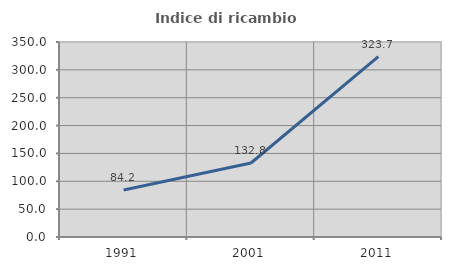
| Category | Indice di ricambio occupazionale  |
|---|---|
| 1991.0 | 84.242 |
| 2001.0 | 132.817 |
| 2011.0 | 323.741 |